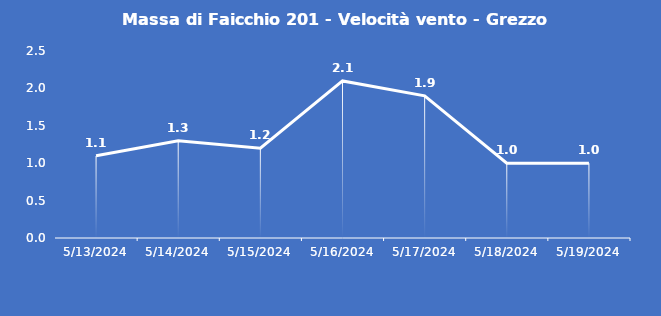
| Category | Massa di Faicchio 201 - Velocità vento - Grezzo (m/s) |
|---|---|
| 5/13/24 | 1.1 |
| 5/14/24 | 1.3 |
| 5/15/24 | 1.2 |
| 5/16/24 | 2.1 |
| 5/17/24 | 1.9 |
| 5/18/24 | 1 |
| 5/19/24 | 1 |